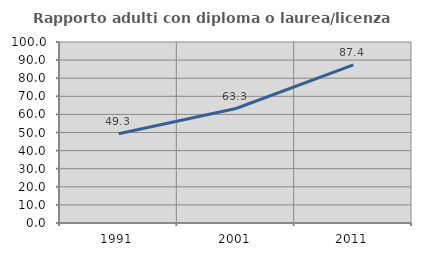
| Category | Rapporto adulti con diploma o laurea/licenza media  |
|---|---|
| 1991.0 | 49.333 |
| 2001.0 | 63.26 |
| 2011.0 | 87.362 |